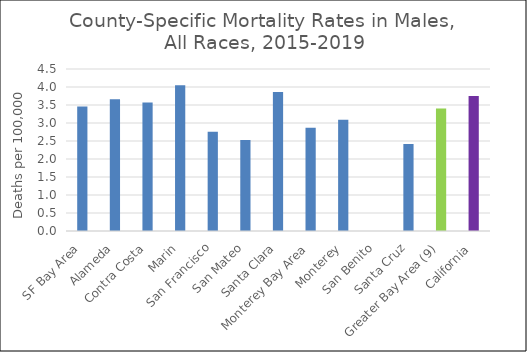
| Category | Male |
|---|---|
| SF Bay Area | 3.46 |
|   Alameda | 3.66 |
|   Contra Costa | 3.57 |
|   Marin | 4.05 |
|   San Francisco | 2.76 |
|   San Mateo | 2.53 |
|   Santa Clara | 3.86 |
| Monterey Bay Area | 2.87 |
|   Monterey | 3.09 |
|   San Benito | 0 |
|   Santa Cruz | 2.42 |
| Greater Bay Area (9) | 3.4 |
| California | 3.75 |